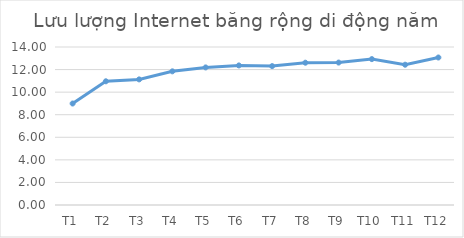
| Category | Series 0 |
|---|---|
| T1 | 8.993 |
| T2 | 10.961 |
| T3 | 11.13 |
| T4 | 11.844 |
| T5 | 12.19 |
| T6 | 12.367 |
| T7 | 12.307 |
| T8 | 12.609 |
| T9 | 12.621 |
| T10 | 12.927 |
| T11 | 12.43 |
| T12 | 13.07 |